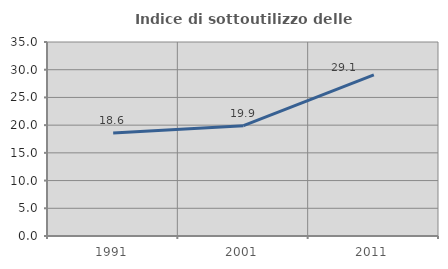
| Category | Indice di sottoutilizzo delle abitazioni  |
|---|---|
| 1991.0 | 18.603 |
| 2001.0 | 19.909 |
| 2011.0 | 29.083 |